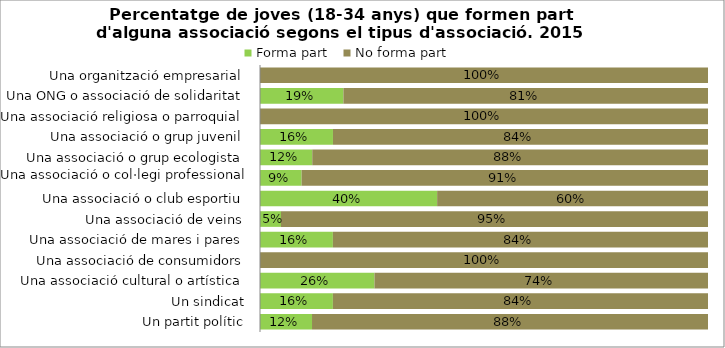
| Category | Forma part | No forma part |
|---|---|---|
| Un partit polític | 0.116 | 0.884 |
| Un sindicat | 0.163 | 0.837 |
| Una associació cultural o artística | 0.255 | 0.745 |
| Una associació de consumidors | 0 | 1 |
| Una associació de mares i pares | 0.163 | 0.837 |
| Una associació de veins | 0.047 | 0.953 |
| Una associació o club esportiu | 0.395 | 0.605 |
| Una associació o col·legi professional | 0.093 | 0.907 |
| Una associació o grup ecologista | 0.117 | 0.883 |
| Una associació o grup juvenil | 0.163 | 0.837 |
| Una associació religiosa o parroquial | 0 | 1 |
| Una ONG o associació de solidaritat | 0.186 | 0.814 |
| Una organització empresarial | 0 | 1 |